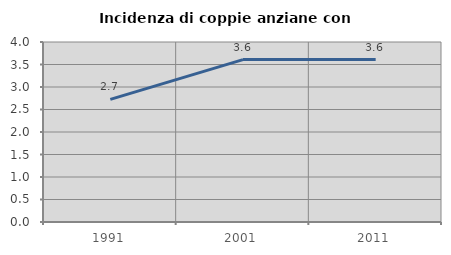
| Category | Incidenza di coppie anziane con figli |
|---|---|
| 1991.0 | 2.726 |
| 2001.0 | 3.609 |
| 2011.0 | 3.609 |